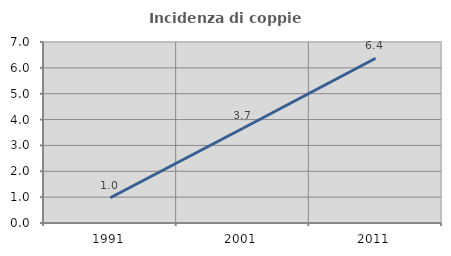
| Category | Incidenza di coppie miste |
|---|---|
| 1991.0 | 0.977 |
| 2001.0 | 3.663 |
| 2011.0 | 6.373 |